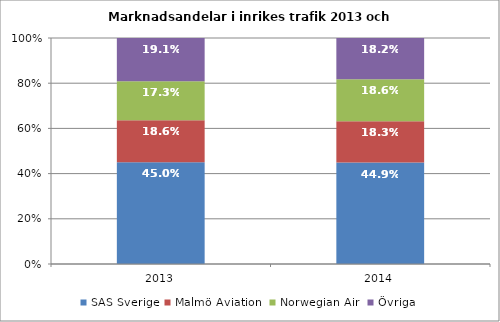
| Category | SAS Sverige | Malmö Aviation  | Norwegian Air  | Övriga |
|---|---|---|---|---|
| 2013.0 | 0.45 | 0.186 | 0.173 | 0.191 |
| 2014.0 | 0.449 | 0.183 | 0.186 | 0.182 |